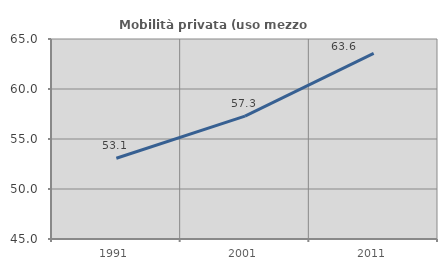
| Category | Mobilità privata (uso mezzo privato) |
|---|---|
| 1991.0 | 53.073 |
| 2001.0 | 57.29 |
| 2011.0 | 63.561 |